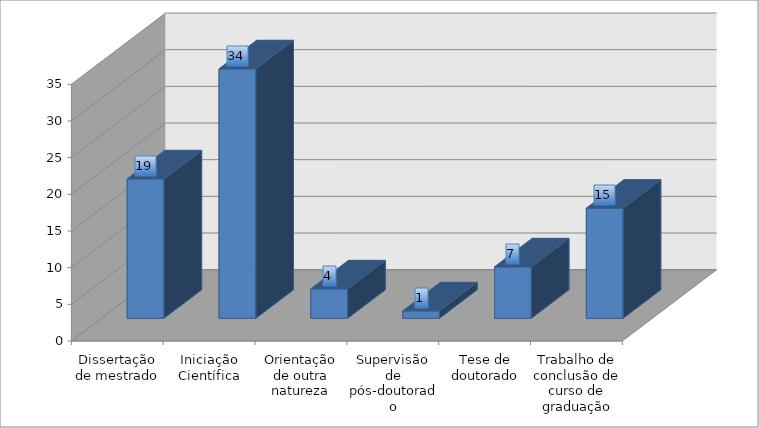
| Category | Total de produções |
|---|---|
| Dissertação de mestrado | 19 |
| Iniciação Científica | 34 |
| Orientação de outra natureza | 4 |
| Supervisão de pós-doutorado | 1 |
| Tese de doutorado | 7 |
| Trabalho de conclusão de curso de graduação | 15 |